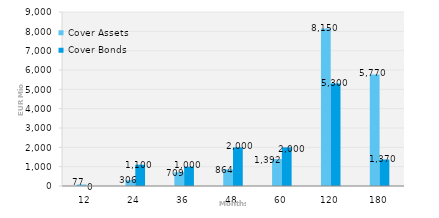
| Category | Cover Assets | Cover Bonds |
|---|---|---|
| 12.0 | 77.289 | 0 |
| 24.0 | 305.803 | 1100 |
| 36.0 | 708.984 | 1000 |
| 48.0 | 864.366 | 2000 |
| 60.0 | 1392.172 | 2000 |
| 120.0 | 8150.322 | 5300 |
| 180.0 | 5770.06 | 1370 |